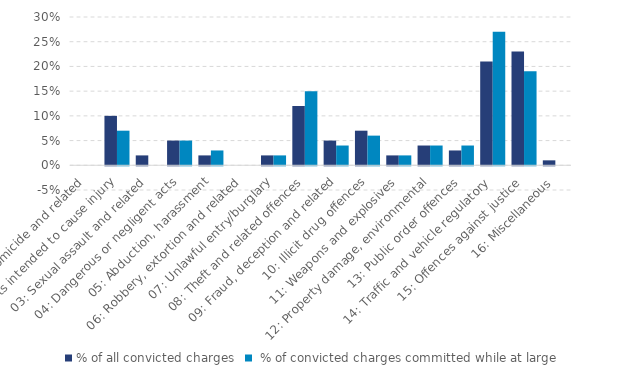
| Category | % of all convicted charges |  % of convicted charges committed while at large |
|---|---|---|
| 01: Homicide and related | 0 | 0 |
| 02: Acts intended to cause injury | 0.1 | 0.07 |
| 03: Sexual assault and related | 0.02 | 0 |
| 04: Dangerous or negligent acts | 0.05 | 0.05 |
| 05: Abduction, harassment | 0.02 | 0.03 |
| 06: Robbery, extortion and related | 0 | 0 |
| 07: Unlawful entry/burglary | 0.02 | 0.02 |
| 08: Theft and related offences | 0.12 | 0.15 |
| 09: Fraud, deception and related | 0.05 | 0.04 |
| 10: Illicit drug offences | 0.07 | 0.06 |
| 11: Weapons and explosives | 0.02 | 0.02 |
| 12: Property damage, environmental | 0.04 | 0.04 |
| 13: Public order offences | 0.03 | 0.04 |
| 14: Traffic and vehicle regulatory | 0.21 | 0.27 |
| 15: Offences against justice | 0.23 | 0.19 |
| 16: Miscellaneous | 0.01 | 0 |